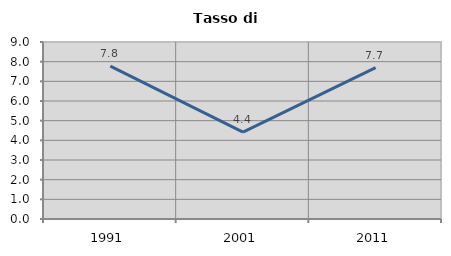
| Category | Tasso di disoccupazione   |
|---|---|
| 1991.0 | 7.777 |
| 2001.0 | 4.415 |
| 2011.0 | 7.692 |